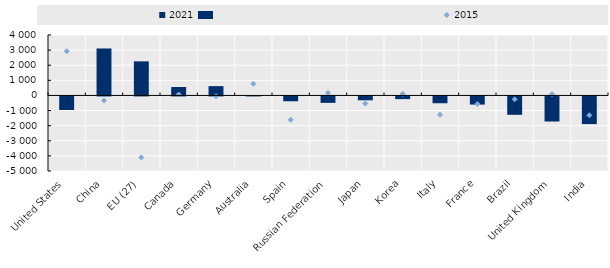
| Category | 2021 |
|---|---|
| United States | -895.961 |
| China | 3108.811 |
| EU (27) | 2256.259 |
| Canada | 558.982 |
| Germany | 616.179 |
| Australia | 5.74 |
| Spain | -318.535 |
| Russian Federation | -424.371 |
| Japan | -255.023 |
| Korea | -177.517 |
| Italy | -450.464 |
| France | -538.79 |
| Brazil | -1216.476 |
| United Kingdom | -1658.026 |
| India | -1831.374 |